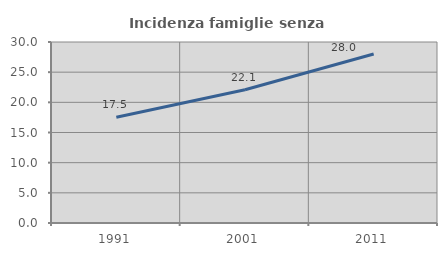
| Category | Incidenza famiglie senza nuclei |
|---|---|
| 1991.0 | 17.528 |
| 2001.0 | 22.092 |
| 2011.0 | 28.003 |